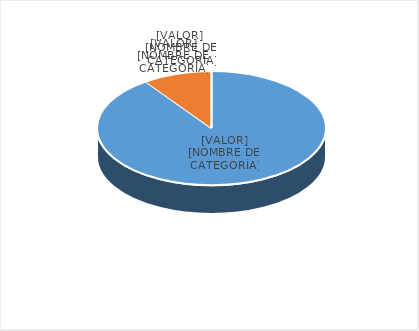
| Category | Series 0 |
|---|---|
| PRESUPUESTO VIGENTE PARA 2023 | 31000000 |
| PRESUPUESTO EJECUTADO  | 3357631.7 |
| PORCENTAJE DE EJECUCIÓN  | 0.108 |